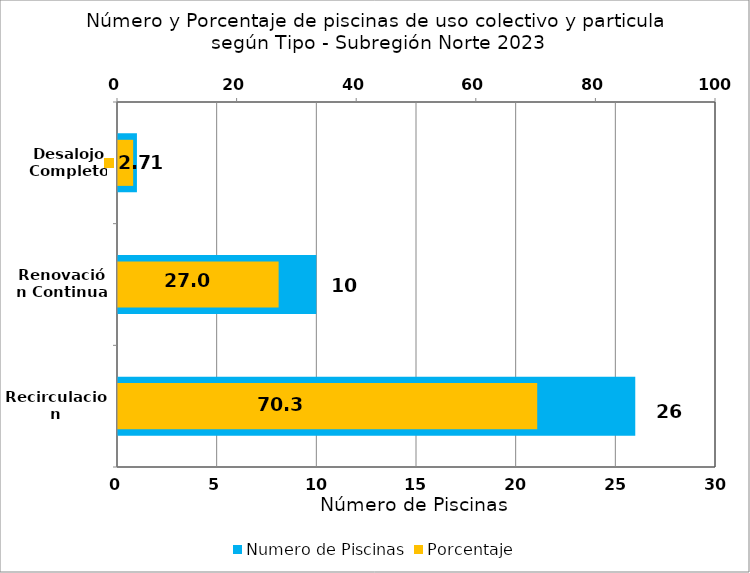
| Category | Numero de Piscinas |
|---|---|
| Recirculacion | 26 |
| Renovación Continua | 10 |
| Desalojo Completo | 1 |